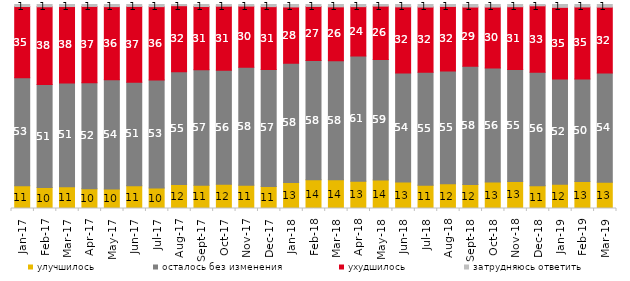
| Category | улучшилось | осталось без изменения | ухудшилось | затрудняюсь ответить |
|---|---|---|---|---|
| 2017-01-01 | 11.15 | 53 | 34.85 | 1 |
| 2017-02-01 | 10.25 | 50.5 | 38.15 | 1.1 |
| 2017-03-01 | 10.7 | 50.75 | 37.5 | 1 |
| 2017-04-01 | 9.7 | 51.95 | 37.4 | 0.95 |
| 2017-05-01 | 9.5 | 53.65 | 35.8 | 1.05 |
| 2017-06-01 | 11.2 | 50.7 | 37.15 | 0.95 |
| 2017-07-01 | 10.05 | 52.95 | 35.95 | 1.05 |
| 2017-08-01 | 11.8 | 55.2 | 32.4 | 0.6 |
| 2017-09-01 | 11.35 | 56.7 | 30.95 | 1 |
| 2017-10-01 | 11.9 | 55.9 | 31.35 | 0.85 |
| 2017-11-01 | 11.45 | 57.85 | 29.9 | 0.8 |
| 2017-12-01 | 10.8 | 57.35 | 30.8 | 1.05 |
| 2018-01-01 | 12.75 | 58.45 | 27.6 | 1.2 |
| 2018-02-01 | 14.1 | 58.4 | 26.55 | 0.95 |
| 2018-03-01 | 14.1 | 58.3 | 26.45 | 1.15 |
| 2018-04-01 | 13.35 | 61.4 | 24.2 | 1.05 |
| 2018-05-01 | 14 | 59.1 | 26.1 | 0.8 |
| 2018-06-01 | 12.95 | 53.5 | 32.4 | 1.15 |
| 2018-07-01 | 11.45 | 55.3 | 32 | 1.25 |
| 2018-08-01 | 12.1 | 55.25 | 31.7 | 0.95 |
| 2018-09-01 | 11.75 | 58 | 29 | 1.25 |
| 2018-10-01 | 12.95 | 55.9 | 29.9 | 1.25 |
| 2018-11-01 | 13.273 | 54.84 | 30.788 | 1.098 |
| 2018-12-01 | 11.2 | 55.6 | 32.55 | 0.65 |
| 2019-01-01 | 11.85 | 51.6 | 35.15 | 1.4 |
| 2019-02-01 | 13.2 | 50.3 | 35.3 | 1.2 |
| 2019-03-01 | 12.929 | 53.506 | 32.273 | 1.293 |